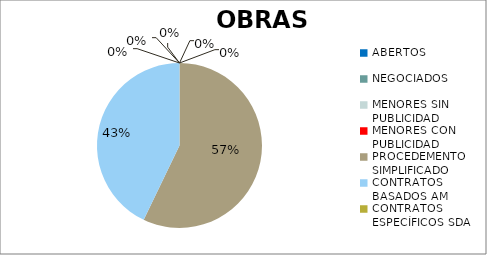
| Category | Series 0 |
|---|---|
| ABERTOS  | 0 |
| NEGOCIADOS  | 0 |
| MENORES SIN PUBLICIDAD | 0 |
| MENORES CON PUBLICIDAD | 0 |
| PROCEDEMENTO SIMPLIFICADO | 0.571 |
| CONTRATOS BASADOS AM | 0.429 |
| CONTRATOS ESPECÍFICOS SDA | 0 |